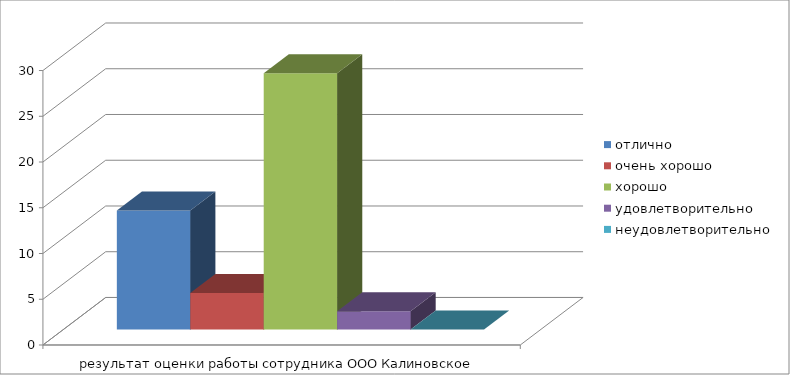
| Category | отлично  | очень хорошо | хорошо | удовлетворительно | неудовлетворительно |
|---|---|---|---|---|---|
| 0 | 13 | 4 | 28 | 2 | 0 |